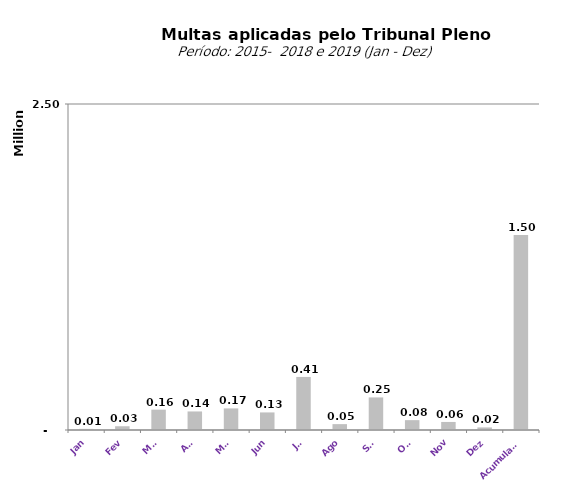
| Category |  1.528.442,62   1.020.189,59   955.160,44   1.276.425,53   2.644.178,81   1.648.289,39   21.112.065,42   6.109.976,68   8.587,38   28.774,76   156.096,39   142.268,21   165.562,13   134.846,46   406.938,07   45.095,60   249.761,95   75.658,32   61.676,48  |
|---|---|
| Jan | 8587.38 |
| Fev | 28774.76 |
| Mar | 156096.39 |
| Abr | 142268.21 |
| Mai | 165562.13 |
| Jun | 134846.46 |
| Jul | 406938.07 |
| Ago | 45095.6 |
| Set | 249761.95 |
| Out | 75658.32 |
| Nov | 61676.48 |
| Dez | 19755.68 |
| Acumulado | 1495021.43 |